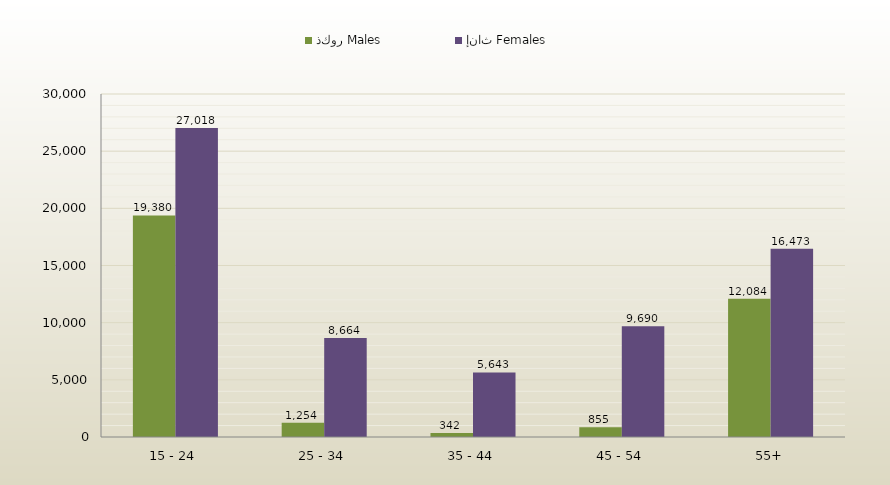
| Category | ذكور Males | إناث Females |
|---|---|---|
| 15 - 24 | 19380 | 27018 |
| 25 - 34 | 1254 | 8664 |
| 35 - 44 | 342 | 5643 |
| 45 - 54 | 855 | 9690 |
| 55+ | 12084 | 16473 |